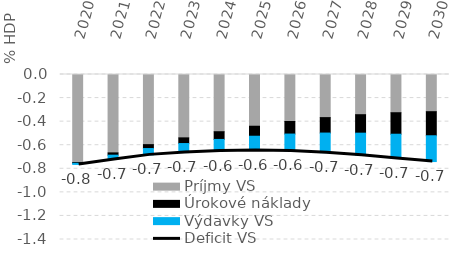
| Category | Príjmy VS | Úrokové náklady | Výdavky VS |
|---|---|---|---|
| 2020.0 | -0.747 | -0.006 | -0.01 |
| 2021.0 | -0.665 | -0.019 | -0.036 |
| 2022.0 | -0.595 | -0.033 | -0.054 |
| 2023.0 | -0.538 | -0.048 | -0.077 |
| 2024.0 | -0.486 | -0.065 | -0.099 |
| 2025.0 | -0.439 | -0.085 | -0.121 |
| 2026.0 | -0.399 | -0.107 | -0.144 |
| 2027.0 | -0.366 | -0.131 | -0.166 |
| 2028.0 | -0.341 | -0.157 | -0.187 |
| 2029.0 | -0.324 | -0.182 | -0.205 |
| 2030.0 | -0.316 | -0.204 | -0.219 |